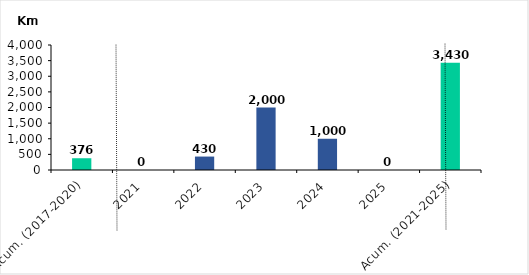
| Category | Series 0 |
|---|---|
| Acum. (2017-2020) | 376.22 |
| 2021 | 0 |
| 2022 | 430 |
| 2023 | 2000 |
| 2024 | 1000 |
| 2025 | 0 |
| Acum. (2021-2025) | 3430 |